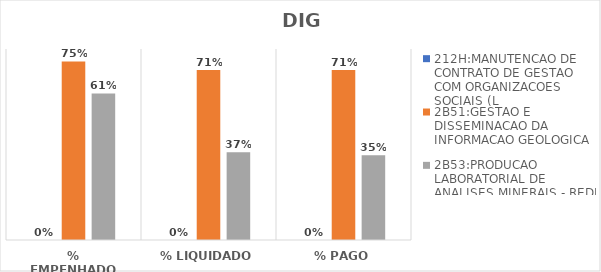
| Category | 212H:MANUTENCAO DE CONTRATO DE GESTAO COM ORGANIZACOES SOCIAIS (L | 2B51:GESTAO E DISSEMINACAO DA INFORMACAO GEOLOGICA | 2B53:PRODUCAO LABORATORIAL DE ANALISES MINERAIS - REDE LAMIN |
|---|---|---|---|
| % EMPENHADO | 0 | 0.748 | 0.614 |
| % LIQUIDADO | 0 | 0.712 | 0.368 |
| % PAGO | 0 | 0.712 | 0.355 |